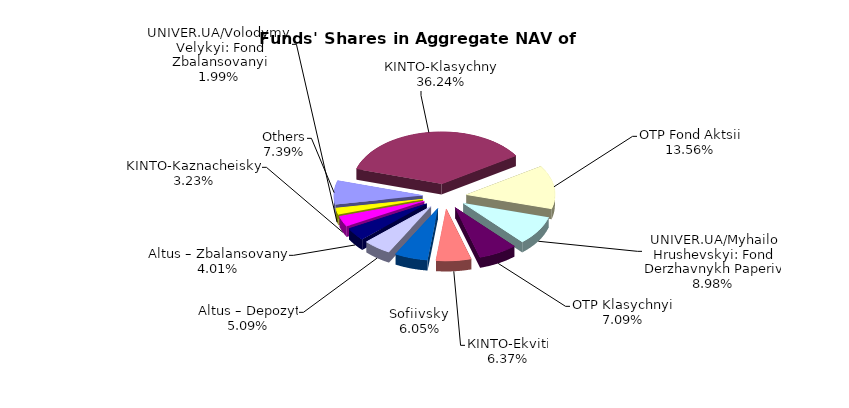
| Category | Series 0 | Series 1 |
|---|---|---|
| Others | 6186385.2 | 0.072 |
| КІNТО-Klasychnyi | 30343158.78 | 0.354 |
| OTP Fond Aktsii | 11355413.91 | 0.132 |
| UNIVER.UA/Myhailo Hrushevskyi: Fond Derzhavnykh Paperiv | 7521745.15 | 0.088 |
| OTP Klasychnyi' | 5940214.13 | 0.069 |
| КІNTO-Ekviti | 5336915.44 | 0.062 |
| Sofiivskyi | 5062148.28 | 0.059 |
| Altus – Depozyt | 4258374.79 | 0.05 |
| Altus – Zbalansovanyi | 3361329.71 | 0.039 |
| KINTO-Kaznacheiskyi | 2705941.65 | 0.032 |
| UNIVER.UA/Volodymyr Velykyi: Fond Zbalansovanyi | 1662247.42 | 0.019 |